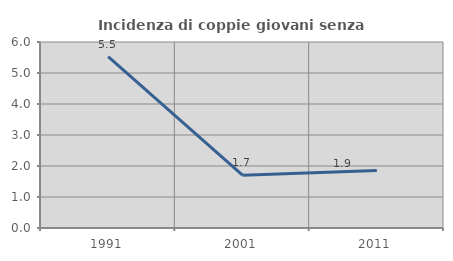
| Category | Incidenza di coppie giovani senza figli |
|---|---|
| 1991.0 | 5.525 |
| 2001.0 | 1.705 |
| 2011.0 | 1.852 |